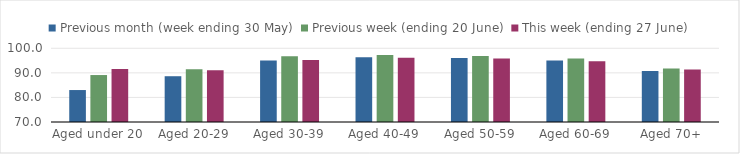
| Category | Previous month (week ending 30 May) | Previous week (ending 20 June) | This week (ending 27 June) |
|---|---|---|---|
| Aged under 20 | 83.006 | 89.112 | 91.57 |
| Aged 20-29 | 88.633 | 91.51 | 91.108 |
| Aged 30-39 | 94.99 | 96.764 | 95.265 |
| Aged 40-49 | 96.335 | 97.25 | 96.121 |
| Aged 50-59 | 96 | 96.905 | 95.893 |
| Aged 60-69 | 95.039 | 95.893 | 94.76 |
| Aged 70+ | 90.749 | 91.807 | 91.346 |